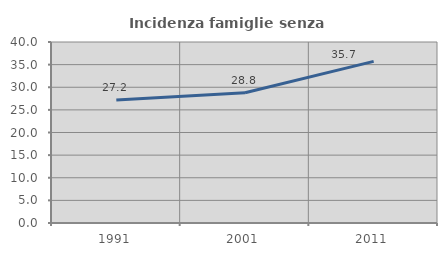
| Category | Incidenza famiglie senza nuclei |
|---|---|
| 1991.0 | 27.202 |
| 2001.0 | 28.793 |
| 2011.0 | 35.713 |